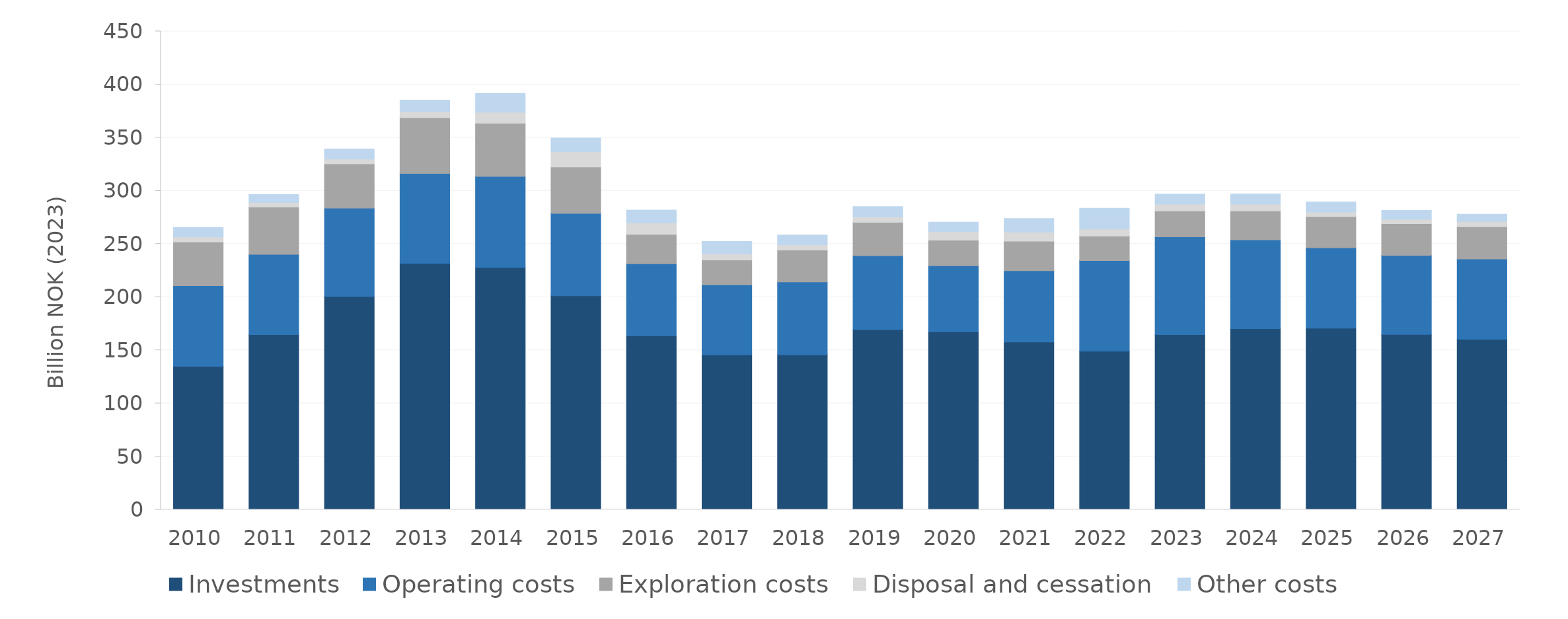
| Category | Investments | Operating costs | Exploration costs | Disposal and cessation | Other costs |
|---|---|---|---|---|---|
| 2010.0 | 134.879 | 75.781 | 41.272 | 4.556 | 9.075 |
| 2011.0 | 164.725 | 75.451 | 44.676 | 4.197 | 7.501 |
| 2012.0 | 200.64 | 83.16 | 41.627 | 4.509 | 9.362 |
| 2013.0 | 231.615 | 84.779 | 52.392 | 5.71 | 10.924 |
| 2014.0 | 227.788 | 85.834 | 49.919 | 10.361 | 17.772 |
| 2015.0 | 201.219 | 77.497 | 43.664 | 14.434 | 12.858 |
| 2016.0 | 163.481 | 67.945 | 27.625 | 10.655 | 12.206 |
| 2017.0 | 145.756 | 65.901 | 23.25 | 6.003 | 11.475 |
| 2018.0 | 145.676 | 68.643 | 29.957 | 5.008 | 9.107 |
| 2019.0 | 169.466 | 69.548 | 31.411 | 5.149 | 9.503 |
| 2020.0 | 167.35 | 62.133 | 24.065 | 7.9 | 9.009 |
| 2021.0 | 157.643 | 67.152 | 27.871 | 8.507 | 12.798 |
| 2022.0 | 149.231 | 85.047 | 23.126 | 6.652 | 19.549 |
| 2023.0 | 164.668 | 92.037 | 24.418 | 6.411 | 9.343 |
| 2024.0 | 170.244 | 83.665 | 27.245 | 6.265 | 9.741 |
| 2025.0 | 170.722 | 75.77 | 29.376 | 4.217 | 9.381 |
| 2026.0 | 164.795 | 74.44 | 29.836 | 4.066 | 8.483 |
| 2027.0 | 160.366 | 75.502 | 30.382 | 4.976 | 6.767 |